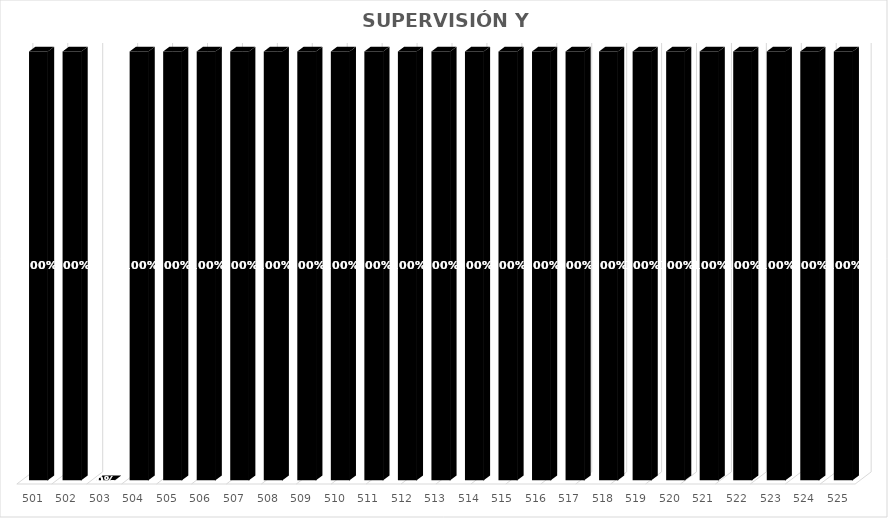
| Category | % Avance |
|---|---|
| 501.0 | 1 |
| 502.0 | 1 |
| 503.0 | 0 |
| 504.0 | 1 |
| 505.0 | 1 |
| 506.0 | 1 |
| 507.0 | 1 |
| 508.0 | 1 |
| 509.0 | 1 |
| 510.0 | 1 |
| 511.0 | 1 |
| 512.0 | 1 |
| 513.0 | 1 |
| 514.0 | 1 |
| 515.0 | 1 |
| 516.0 | 1 |
| 517.0 | 1 |
| 518.0 | 1 |
| 519.0 | 1 |
| 520.0 | 1 |
| 521.0 | 1 |
| 522.0 | 1 |
| 523.0 | 1 |
| 524.0 | 1 |
| 525.0 | 1 |